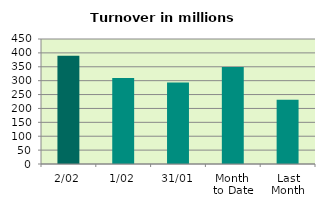
| Category | Series 0 |
|---|---|
| 2/02 | 389.312 |
| 1/02 | 309.665 |
| 31/01 | 293.136 |
| Month 
to Date | 349.488 |
| Last
Month | 231.348 |